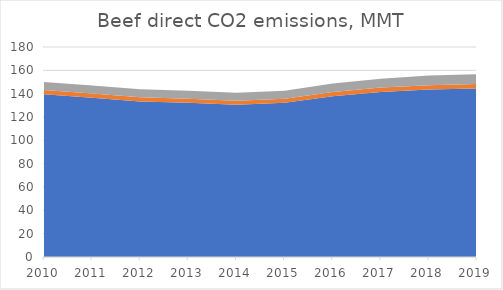
| Category | Enteric CH4 | Manure CH4 | Manure N2O |
|---|---|---|---|
| 2010.0 | 139.552 | 3.696 | 6.704 |
| 2011.0 | 136.444 | 3.668 | 6.864 |
| 2012.0 | 133.364 | 3.584 | 6.837 |
| 2013.0 | 132.216 | 3.416 | 6.89 |
| 2014.0 | 130.48 | 3.36 | 6.89 |
| 2015.0 | 132.216 | 3.528 | 6.837 |
| 2016.0 | 137.732 | 3.696 | 7.208 |
| 2017.0 | 141.456 | 3.808 | 7.606 |
| 2018.0 | 143.5 | 3.78 | 8.215 |
| 2019.0 | 144.536 | 3.808 | 8.348 |